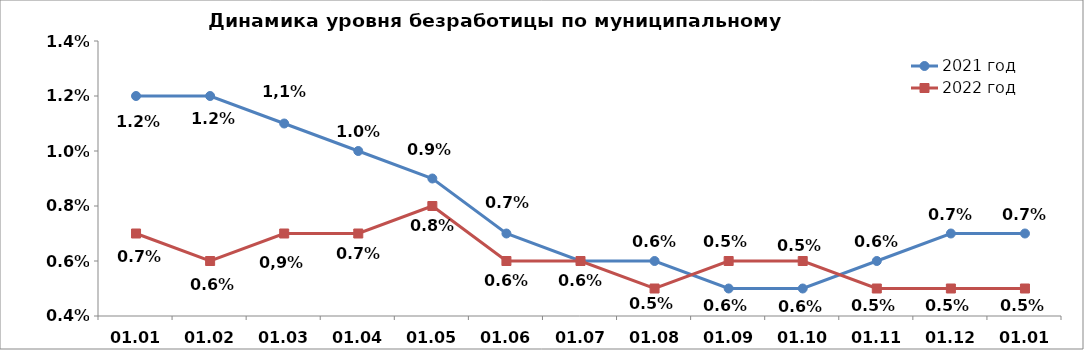
| Category | 2021 год | 2022 год |
|---|---|---|
| 01.01 | 0.012 | 0.007 |
| 01.02 | 0.012 | 0.006 |
| 01.03 | 0.011 | 0.007 |
| 01.04 | 0.01 | 0.007 |
| 01.05 | 0.009 | 0.008 |
| 01.06 | 0.007 | 0.006 |
| 01.07 | 0.006 | 0.006 |
| 01.08 | 0.006 | 0.005 |
| 01.09 | 0.005 | 0.006 |
| 01.10 | 0.005 | 0.006 |
| 01.11 | 0.006 | 0.005 |
| 01.12 | 0.007 | 0.005 |
| 01.01 | 0.007 | 0.005 |